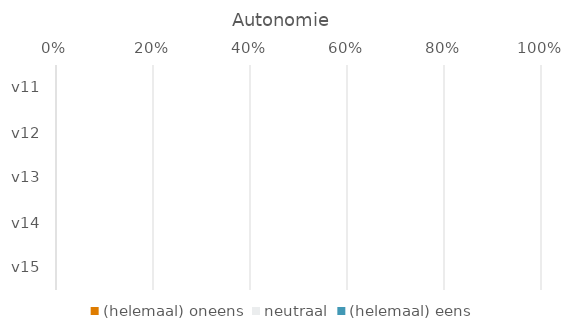
| Category | (helemaal) oneens | neutraal | (helemaal) eens |
|---|---|---|---|
| v11 | 0 | 0 | 0 |
| v12 | 0 | 0 | 0 |
| v13 | 0 | 0 | 0 |
| v14 | 0 | 0 | 0 |
| v15 | 0 | 0 | 0 |